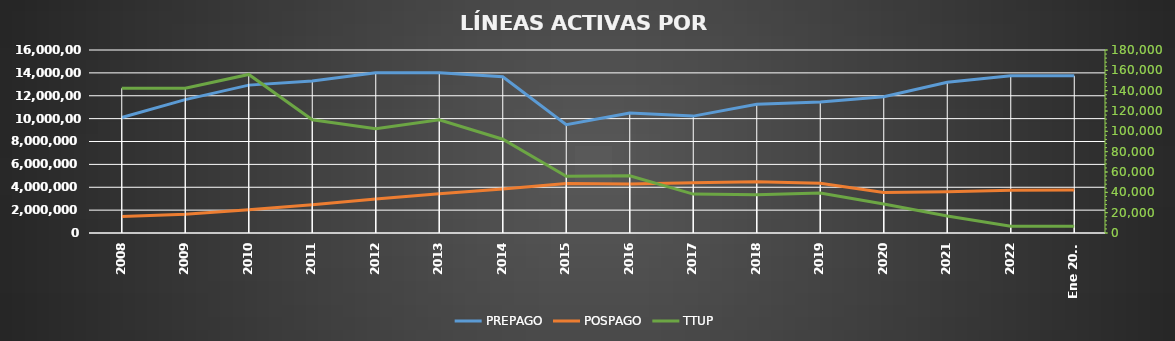
| Category | PREPAGO | POSPAGO |
|---|---|---|
| 2008 | 10097768 | 1452088 |
| 2009 | 11662294 | 1649838 |
| 2010 | 12929040 | 2033814 |
| 2011 | 13295834 | 2467378 |
| 2012 | 14008104 | 2976194 |
| 2013 | 14005126 | 3425277 |
| 2014 | 13666071 | 3846271 |
| 2015 | 9476240 | 4326937 |
| 2016 | 10498467 | 4293426 |
| 2017 | 10219457 | 4393703 |
| 2018 | 11254168 | 4480975 |
| 2019 | 11462048 | 4351686 |
| 2020 | 11917697 | 3539192 |
| 2021 | 13174530 | 3598383 |
| 2022 | 13740159 | 3743849 |
| Ene 2023 | 13744592 | 3762200 |